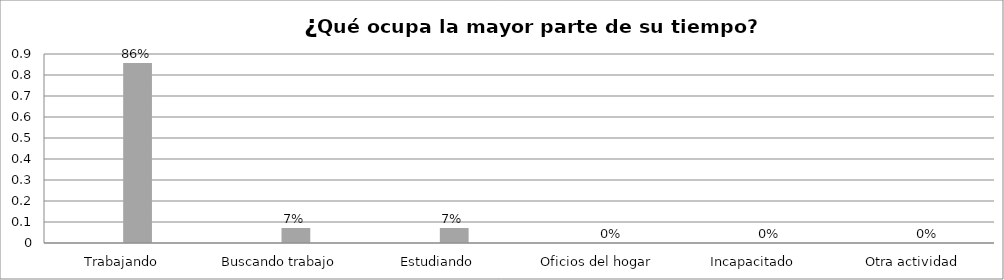
| Category | Series 0 | Series 1 | Series 2 | Series 3 |
|---|---|---|---|---|
| Trabajando |  |  | 0.857 |  |
| Buscando trabajo |  |  | 0.071 |  |
| Estudiando |  |  | 0.071 |  |
| Oficios del hogar |  |  | 0 |  |
| Incapacitado  |  |  | 0 |  |
| Otra actividad |  |  | 0 |  |